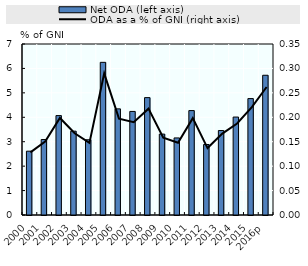
| Category | Net ODA (left axis) |
|---|---|
| 2000 | 2612.812 |
| 2001 | 3089.398 |
| 2002 | 4069.279 |
| 2003 | 3431.657 |
| 2004 | 3080.07 |
| 2005 | 6249.318 |
| 2006 | 4344.898 |
| 2007 | 4239.693 |
| 2008 | 4804.852 |
| 2009 | 3311.902 |
| 2010 | 3154.638 |
| 2011 | 4274.362 |
| 2012 | 2885.784 |
| 2013 | 3457.401 |
| 2014 | 4009.18 |
| 2015 | 4765.755 |
| 2016p | 5720.487 |